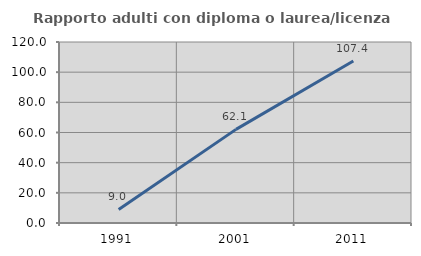
| Category | Rapporto adulti con diploma o laurea/licenza media  |
|---|---|
| 1991.0 | 8.955 |
| 2001.0 | 62.069 |
| 2011.0 | 107.447 |